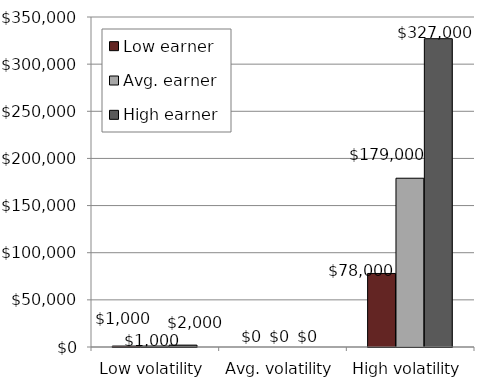
| Category | Low earner | Avg. earner | High earner |
|---|---|---|---|
| Low volatility | 1000 | 1000 | 2000 |
| Avg. volatility | 0 | 0 | 0 |
| High volatility | 78000 | 179000 | 327000 |